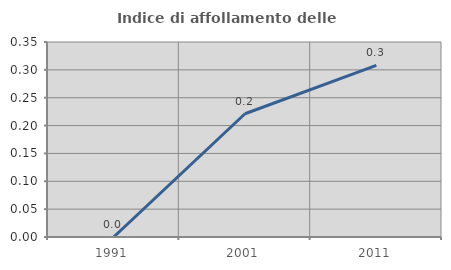
| Category | Indice di affollamento delle abitazioni  |
|---|---|
| 1991.0 | 0 |
| 2001.0 | 0.221 |
| 2011.0 | 0.308 |